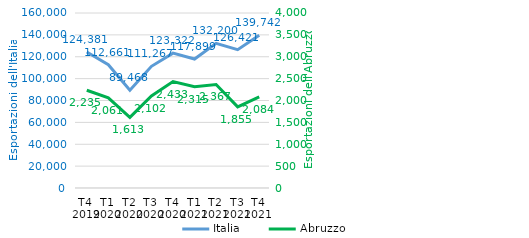
| Category | Italia |
|---|---|
| T4 
2019 | 124381.053 |
| T1
2020 | 112660.733 |
| T2
2020 | 89468.132 |
| T3
2020 | 111267.087 |
| T4
2020 | 123321.887 |
| T1
2021 | 117898.949 |
| T2
2021 | 132200.24 |
| T3
2021 | 126421.009 |
| T4
2021 | 139741.555 |